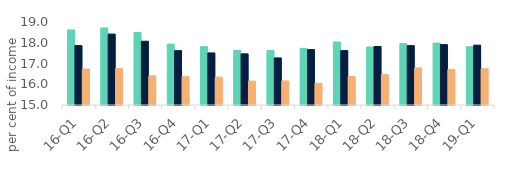
| Category | First-time
buyers | Homemovers | Homowner remortgaging |
|---|---|---|---|
| 16-Q1 | 18.619 | 17.862 | 16.736 |
| 16-Q2 | 18.714 | 18.417 | 16.751 |
| 16-Q3 | 18.493 | 18.072 | 16.409 |
| 16-Q4 | 17.933 | 17.62 | 16.366 |
| 17-Q1 | 17.812 | 17.51 | 16.346 |
| 17-Q2 | 17.635 | 17.465 | 16.152 |
| 17-Q3 | 17.63 | 17.269 | 16.159 |
| 17-Q4 | 17.729 | 17.668 | 16.047 |
| 18-Q1 | 18.037 | 17.621 | 16.368 |
| 18-Q2 | 17.797 | 17.82 | 16.462 |
| 18-Q3 | 17.96 | 17.862 | 16.789 |
| 18-Q4 | 17.982 | 17.911 | 16.707 |
| 19-Q1 | 17.808 | 17.885 | 16.748 |